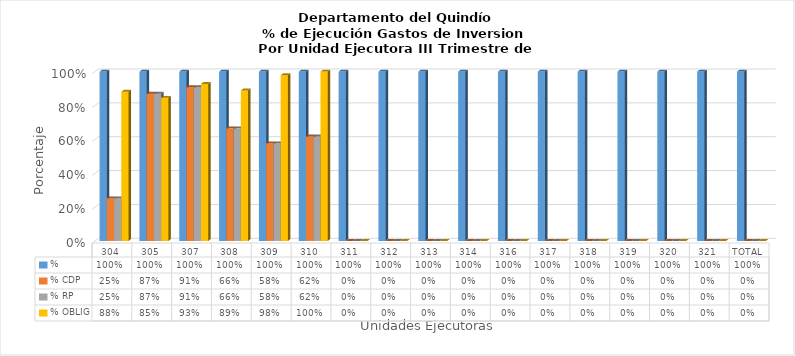
| Category | % | % CDP | % RP | % OBLIG |
|---|---|---|---|---|
| 304 | 1 | 0.252 | 0.252 | 0.881 |
| 305 | 1 | 0.87 | 0.87 | 0.846 |
| 307 | 1 | 0.908 | 0.908 | 0.927 |
| 308 | 1 | 0.665 | 0.665 | 0.889 |
| 309 | 1 | 0.577 | 0.577 | 0.979 |
| 310 | 1 | 0.617 | 0.617 | 1 |
| 311 | 1 | 0 | 0 | 0 |
| 312 | 1 | 0 | 0 | 0 |
| 313 | 1 | 0 | 0 | 0 |
| 314 | 1 | 0 | 0 | 0 |
| 316 | 1 | 0 | 0 | 0 |
| 317 | 1 | 0 | 0 | 0 |
| 318 | 1 | 0 | 0 | 0 |
| 319 | 1 | 0 | 0 | 0 |
| 320 | 1 | 0 | 0 | 0 |
| 321 | 1 | 0 | 0 | 0 |
| TOTAL | 1 | 0 | 0 | 0 |